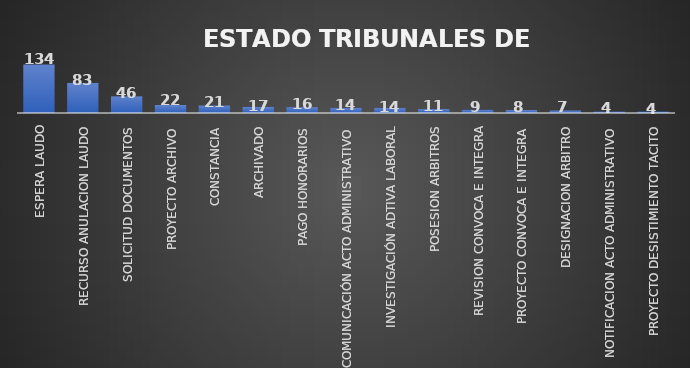
| Category | CANTIDAD | % |
|---|---|---|
| ESPERA LAUDO | 134 | 0.313 |
| RECURSO ANULACION LAUDO | 83 | 0.18 |
| SOLICITUD DOCUMENTOS | 46 | 0.114 |
| PROYECTO ARCHIVO | 22 | 0.058 |
| CONSTANCIA | 21 | 0.044 |
| ARCHIVADO | 17 | 0.034 |
| PAGO HONORARIOS | 16 | 0.03 |
| COMUNICACIÓN ACTO ADMINISTRATIVO | 14 | 0.024 |
| INVESTIGACIÓN ADTIVA LABORAL | 14 | 0.029 |
| POSESION ARBITROS | 11 | 0.028 |
| REVISION CONVOCA E INTEGRA | 9 | 0.018 |
| PROYECTO CONVOCA E INTEGRA | 8 | 0.017 |
| DESIGNACION ARBITRO | 7 | 0.019 |
| NOTIFICACION ACTO ADMINISTRATIVO | 4 | 0.006 |
| PROYECTO DESISTIMIENTO TACITO | 4 | 0.011 |